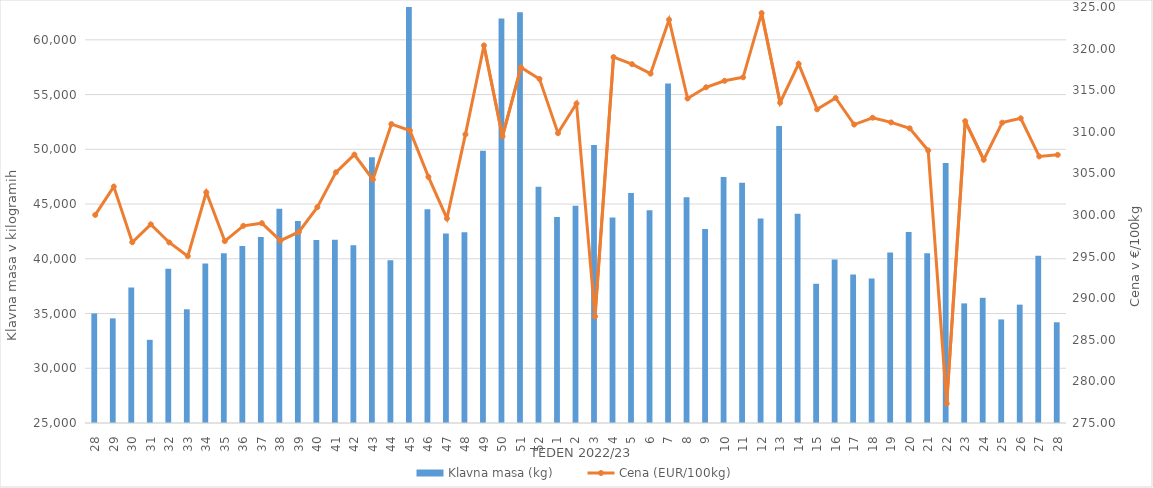
| Category | Klavna masa (kg) |
|---|---|
| 28.0 | 35007 |
| 29.0 | 34559 |
| 30.0 | 37366 |
| 31.0 | 32599 |
| 32.0 | 39100 |
| 33.0 | 35388 |
| 34.0 | 39563 |
| 35.0 | 40507 |
| 36.0 | 41176 |
| 37.0 | 41983 |
| 38.0 | 44572 |
| 39.0 | 43447 |
| 40.0 | 41711 |
| 41.0 | 41736 |
| 42.0 | 41239 |
| 43.0 | 49284 |
| 44.0 | 39877 |
| 45.0 | 63668 |
| 46.0 | 44528 |
| 47.0 | 42319 |
| 48.0 | 42416 |
| 49.0 | 49873 |
| 50.0 | 61942 |
| 51.0 | 62514 |
| 52.0 | 46589 |
| 1.0 | 43807 |
| 2.0 | 44834 |
| 3.0 | 50386 |
| 4.0 | 43773 |
| 5.0 | 46011 |
| 6.0 | 44439 |
| 7.0 | 56001 |
| 8.0 | 45613 |
| 9.0 | 42730 |
| 10.0 | 47471 |
| 11.0 | 46952 |
| 12.0 | 43683 |
| 13.0 | 52135 |
| 14.0 | 44103 |
| 15.0 | 37719 |
| 16.0 | 39943 |
| 17.0 | 38574 |
| 18.0 | 38200 |
| 19.0 | 40581 |
| 20.0 | 42443 |
| 21.0 | 40517 |
| 22.0 | 48742 |
| 23.0 | 35927 |
| 24.0 | 36436 |
| 25.0 | 34463 |
| 26.0 | 35812 |
| 27.0 | 40280 |
| 28.0 | 34201 |